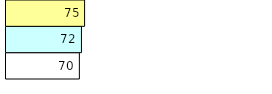
| Category | Total Standouts | Total Recd | Total Tipsters |
|---|---|---|---|
| 0 | 70 | 72 | 75 |